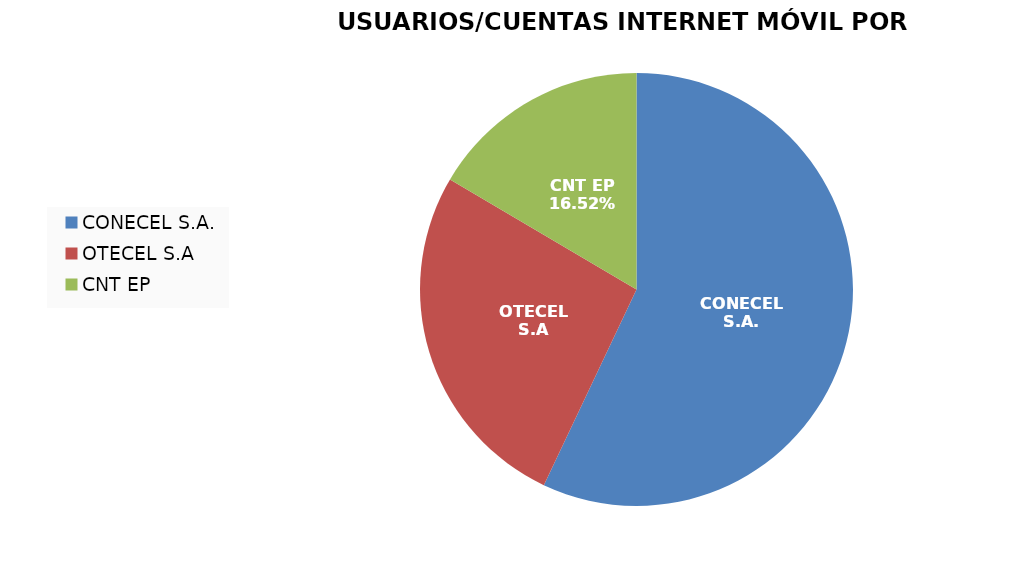
| Category | Series 0 |
|---|---|
| CONECEL S.A. | 5325131 |
| OTECEL S.A | 2468407 |
| CNT EP | 1542292 |